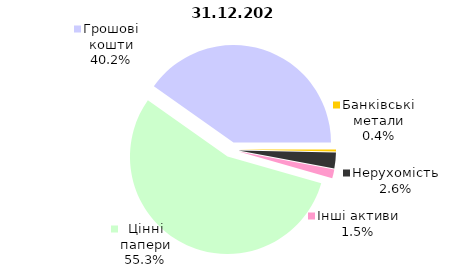
| Category | 30.09.2022 |
|---|---|
| Цінні папери | 2294.745 |
| Грошові кошти | 1666.39 |
| Банківські метали | 14.73 |
| Нерухомість | 108.949 |
| Інші активи | 61.381 |